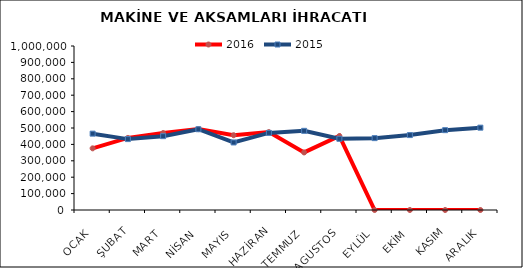
| Category | 2016 | 2015 |
|---|---|---|
| OCAK | 376006.316 | 465536.704 |
| ŞUBAT | 439426.093 | 432304.079 |
| MART | 469331.105 | 450256.798 |
| NİSAN | 493205.871 | 492498.433 |
| MAYIS | 455945.281 | 411800.54 |
| HAZİRAN | 474929.709 | 470042.163 |
| TEMMUZ | 350995.596 | 482673.677 |
| AGUSTOS | 451204.392 | 434256.25 |
| EYLÜL | 0 | 438245.405 |
| EKİM | 0 | 456822.345 |
| KASIM | 0 | 486784.657 |
| ARALIK | 0 | 502032.977 |